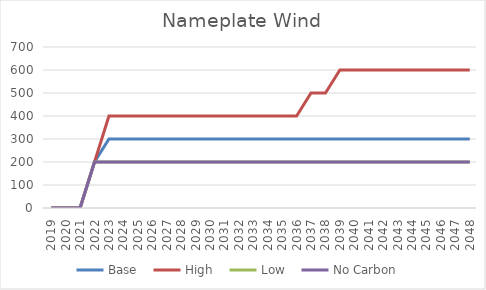
| Category | Base | High | Low | No Carbon |
|---|---|---|---|---|
| 2019.0 | 0 | 0 | 0 | 0 |
| 2020.0 | 0 | 0 | 0 | 0 |
| 2021.0 | 0 | 0 | 0 | 0 |
| 2022.0 | 200 | 200 | 200 | 200 |
| 2023.0 | 300 | 400 | 200 | 200 |
| 2024.0 | 300 | 400 | 200 | 200 |
| 2025.0 | 300 | 400 | 200 | 200 |
| 2026.0 | 300 | 400 | 200 | 200 |
| 2027.0 | 300 | 400 | 200 | 200 |
| 2028.0 | 300 | 400 | 200 | 200 |
| 2029.0 | 300 | 400 | 200 | 200 |
| 2030.0 | 300 | 400 | 200 | 200 |
| 2031.0 | 300 | 400 | 200 | 200 |
| 2032.0 | 300 | 400 | 200 | 200 |
| 2033.0 | 300 | 400 | 200 | 200 |
| 2034.0 | 300 | 400 | 200 | 200 |
| 2035.0 | 300 | 400 | 200 | 200 |
| 2036.0 | 300 | 400 | 200 | 200 |
| 2037.0 | 300 | 500 | 200 | 200 |
| 2038.0 | 300 | 500 | 200 | 200 |
| 2039.0 | 300 | 600 | 200 | 200 |
| 2040.0 | 300 | 600 | 200 | 200 |
| 2041.0 | 300 | 600 | 200 | 200 |
| 2042.0 | 300 | 600 | 200 | 200 |
| 2043.0 | 300 | 600 | 200 | 200 |
| 2044.0 | 300 | 600 | 200 | 200 |
| 2045.0 | 300 | 600 | 200 | 200 |
| 2046.0 | 300 | 600 | 200 | 200 |
| 2047.0 | 300 | 600 | 200 | 200 |
| 2048.0 | 300 | 600 | 200 | 200 |